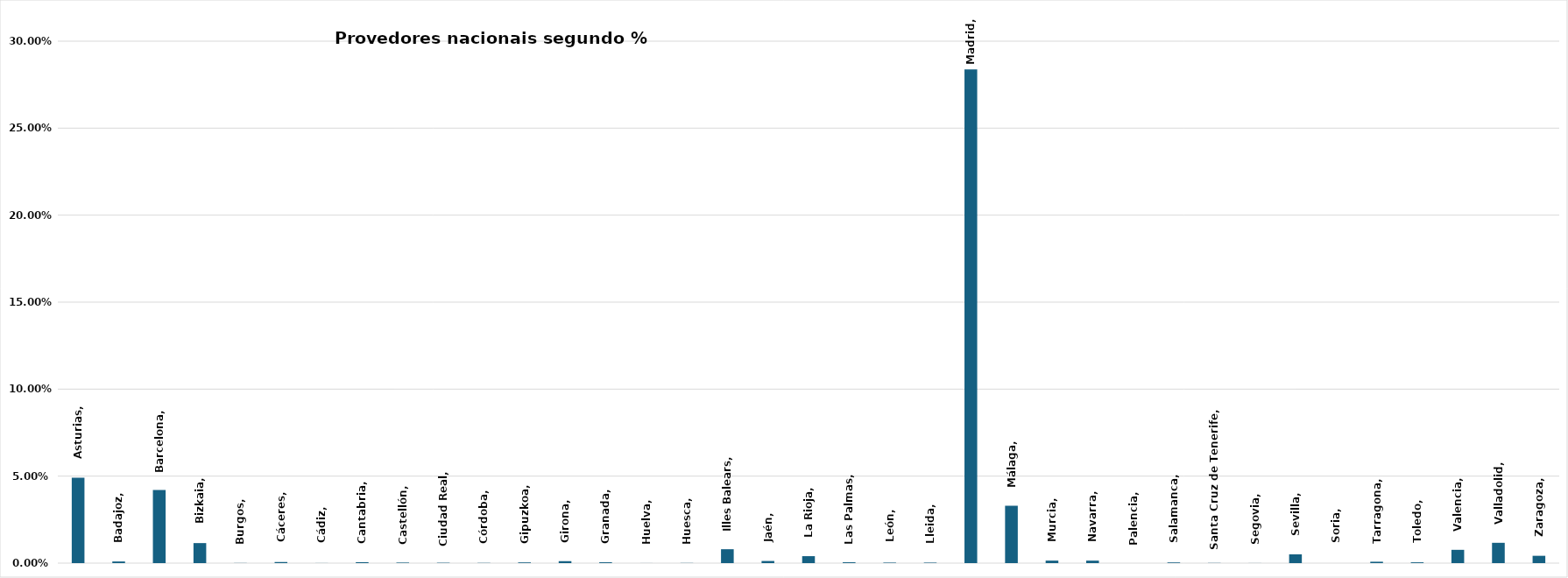
| Category | Series 0 |
|---|---|
| Asturias | 0.049 |
| Badajoz | 0.001 |
| Barcelona | 0.042 |
| Bizkaia | 0.012 |
| Burgos | 0 |
| Cáceres | 0.001 |
| Cádiz | 0 |
| Cantabria | 0.001 |
| Castellón | 0 |
| Ciudad Real | 0 |
| Córdoba | 0 |
| Gipuzkoa | 0 |
| Girona | 0.001 |
| Granada | 0 |
| Huelva | 0 |
| Huesca | 0 |
| Illes Balears | 0.008 |
| Jaén | 0.001 |
| La Rioja | 0.004 |
| Las Palmas | 0 |
| León | 0 |
| Lleida | 0 |
| Madrid | 0.284 |
| Málaga | 0.033 |
| Murcia | 0.001 |
| Navarra | 0.001 |
| Palencia | 0 |
| Salamanca | 0 |
| Santa Cruz de Tenerife | 0 |
| Segovia | 0 |
| Sevilla | 0.005 |
| Soria | 0 |
| Tarragona | 0.001 |
| Toledo | 0 |
| Valencia | 0.008 |
| Valladolid | 0.012 |
| Zaragoza | 0.004 |